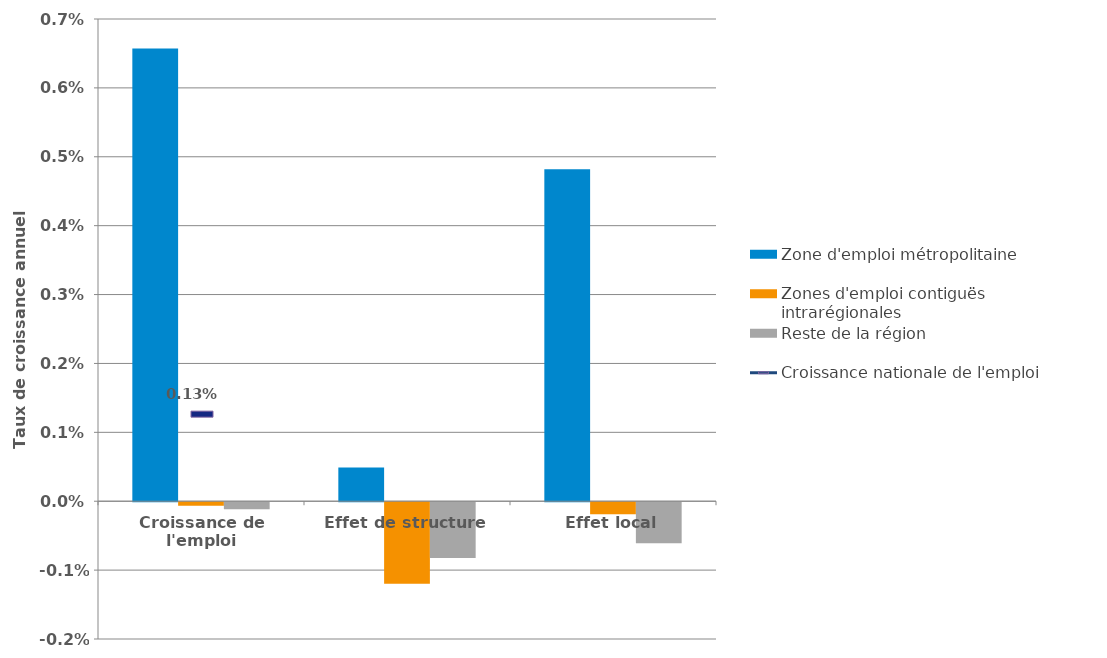
| Category | Zone d'emploi métropolitaine | Zones d'emploi contiguës intrarégionales | Reste de la région |
|---|---|---|---|
| Croissance de l'emploi | 0.007 | 0 | 0 |
| Effet de structure | 0 | -0.001 | -0.001 |
| Effet local | 0.005 | 0 | -0.001 |